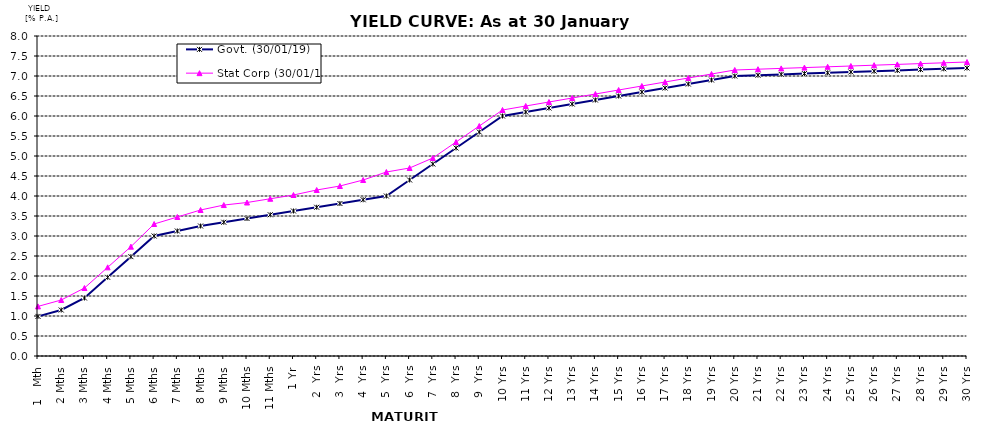
| Category | Govt. (30/01/19) | Stat Corp (30/01/19) |
|---|---|---|
| 1   Mth | 0.99 | 1.24 |
| 2 Mths | 1.15 | 1.4 |
| 3 Mths | 1.45 | 1.7 |
| 4 Mths | 1.967 | 2.217 |
| 5 Mths | 2.483 | 2.733 |
| 6 Mths | 3 | 3.3 |
| 7 Mths | 3.125 | 3.475 |
| 8 Mths | 3.25 | 3.65 |
| 9 Mths | 3.344 | 3.774 |
| 10 Mths | 3.438 | 3.838 |
| 11 Mths | 3.531 | 3.931 |
| 1 Yr | 3.625 | 4.025 |
| 2  Yrs | 3.719 | 4.15 |
| 3  Yrs | 3.812 | 4.25 |
| 4  Yrs | 3.906 | 4.4 |
| 5  Yrs | 4 | 4.6 |
| 6  Yrs | 4.4 | 4.7 |
| 7  Yrs | 4.8 | 4.95 |
| 8  Yrs | 5.2 | 5.35 |
| 9  Yrs | 5.6 | 5.75 |
| 10 Yrs | 6 | 6.15 |
| 11 Yrs | 6.1 | 6.25 |
| 12 Yrs | 6.2 | 6.35 |
| 13 Yrs | 6.3 | 6.45 |
| 14 Yrs | 6.4 | 6.55 |
| 15 Yrs | 6.5 | 6.65 |
| 16 Yrs | 6.6 | 6.75 |
| 17 Yrs | 6.7 | 6.85 |
| 18 Yrs | 6.8 | 6.95 |
| 19 Yrs | 6.9 | 7.05 |
| 20 Yrs | 7 | 7.15 |
| 21 Yrs | 7.02 | 7.17 |
| 22 Yrs | 7.04 | 7.19 |
| 23 Yrs | 7.06 | 7.21 |
| 24 Yrs | 7.08 | 7.23 |
| 25 Yrs | 7.1 | 7.25 |
| 26 Yrs | 7.12 | 7.27 |
| 27 Yrs | 7.14 | 7.29 |
| 28 Yrs | 7.16 | 7.31 |
| 29 Yrs | 7.18 | 7.33 |
| 30 Yrs | 7.2 | 7.35 |